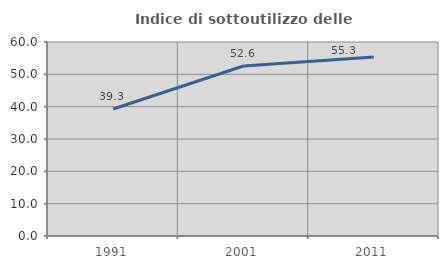
| Category | Indice di sottoutilizzo delle abitazioni  |
|---|---|
| 1991.0 | 39.286 |
| 2001.0 | 52.571 |
| 2011.0 | 55.33 |